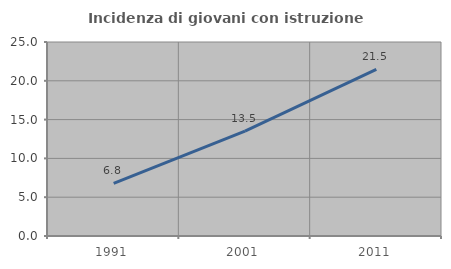
| Category | Incidenza di giovani con istruzione universitaria |
|---|---|
| 1991.0 | 6.792 |
| 2001.0 | 13.503 |
| 2011.0 | 21.459 |